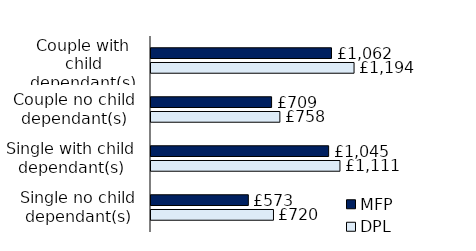
| Category | DPL | MFP |
|---|---|---|
| Single no child dependant(s) | 720.45 | 572.52 |
| Single with child dependant(s) | 1111.49 | 1044.87 |
| Couple no child dependant(s) | 758 | 709.36 |
| Couple with child dependant(s) | 1194.45 | 1061.85 |